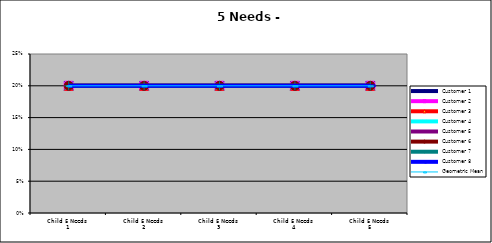
| Category | Customer 1 | Customer 2 | Customer 3 | Customer 4 | Customer 5 | Customer 6 | Customer 7 | Customer 8 | Geometric Mean |
|---|---|---|---|---|---|---|---|---|---|
| Child 5 Needs 1 | 0.2 | 0.2 | 0.2 | 0.2 | 0.2 | 0.2 | 0.2 | 0.2 | 0.2 |
| Child 5 Needs 2 | 0.2 | 0.2 | 0.2 | 0.2 | 0.2 | 0.2 | 0.2 | 0.2 | 0.2 |
| Child 5 Needs 3 | 0.2 | 0.2 | 0.2 | 0.2 | 0.2 | 0.2 | 0.2 | 0.2 | 0.2 |
| Child 5 Needs 4 | 0.2 | 0.2 | 0.2 | 0.2 | 0.2 | 0.2 | 0.2 | 0.2 | 0.2 |
| Child 5 Needs 5 | 0.2 | 0.2 | 0.2 | 0.2 | 0.2 | 0.2 | 0.2 | 0.2 | 0.2 |